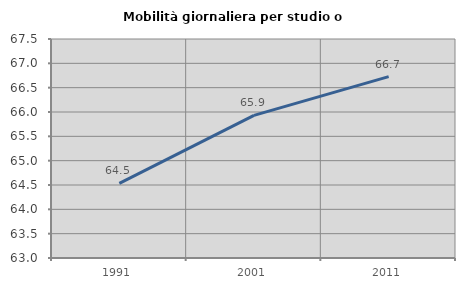
| Category | Mobilità giornaliera per studio o lavoro |
|---|---|
| 1991.0 | 64.535 |
| 2001.0 | 65.932 |
| 2011.0 | 66.728 |